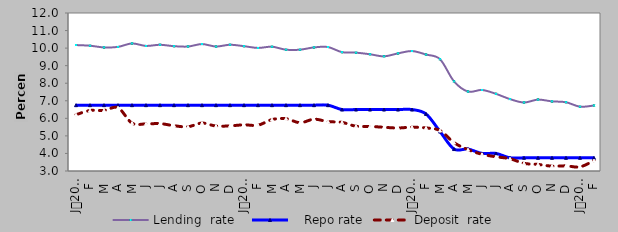
| Category | Lending  rate |    Repo rate | Deposit  rate |
|---|---|---|---|
| 0 | 10.174 | 6.75 | 6.207 |
| 1900-01-01 | 10.136 | 6.75 | 6.446 |
| 1900-01-02 | 10.04 | 6.75 | 6.45 |
| 1900-01-03 | 10.07 | 6.75 | 6.6 |
| 1900-01-04 | 10.265 | 6.75 | 5.728 |
| 1900-01-05 | 10.125 | 6.75 | 5.682 |
| 1900-01-06 | 10.19 | 6.75 | 5.7 |
| 1900-01-07 | 10.11 | 6.75 | 5.58 |
| 1900-01-08 | 10.09 | 6.75 | 5.52 |
| 1900-01-09 | 10.23 | 6.75 | 5.73 |
| 1900-01-10 | 10.09 | 6.75 | 5.56 |
| 1900-01-11 | 10.192 | 6.75 | 5.572 |
| 1900-01-12 | 10.11 | 6.75 | 5.63 |
| 1900-01-13 | 10.01 | 6.75 | 5.61 |
| 1900-01-14 | 10.08 | 6.75 | 5.93 |
| 1900-01-15 | 9.91 | 6.75 | 5.98 |
| 1900-01-16 | 9.91 | 6.75 | 5.75 |
| 1900-01-17 | 10.04 | 6.75 | 5.95 |
| 1900-01-18 | 10.06 | 6.75 | 5.813 |
| 1900-01-19 | 9.77 | 6.5 | 5.77 |
| 1900-01-20 | 9.74 | 6.5 | 5.55 |
| 1900-01-21 | 9.65 | 6.5 | 5.54 |
| 1900-01-22 | 9.53 | 6.5 | 5.49 |
| 1900-01-23 | 9.7 | 6.5 | 5.45 |
| 1900-01-24 | 9.833 | 6.5 | 5.497 |
| 1900-01-25 | 9.634 | 6.25 | 5.454 |
| 1900-01-26 | 9.369 | 5.25 | 5.304 |
| 1900-01-27 | 8.106 | 4.25 | 4.617 |
| 1900-01-28 | 7.526 | 4.25 | 4.216 |
| 1900-01-29 | 7.616 | 4 | 3.953 |
| 1900-01-30 | 7.394 | 4 | 3.809 |
| 1900-01-31 | 7.095 | 3.75 | 3.699 |
| 1900-02-01 | 6.902 | 3.75 | 3.437 |
| 1900-02-02 | 7.067 | 3.75 | 3.374 |
| 1900-02-03 | 6.965 | 3.75 | 3.276 |
| 1900-02-04 | 6.917 | 3.75 | 3.292 |
| 1900-02-05 | 6.663 | 3.75 | 3.236 |
| 1900-02-06 | 6.731 | 3.75 | 3.592 |